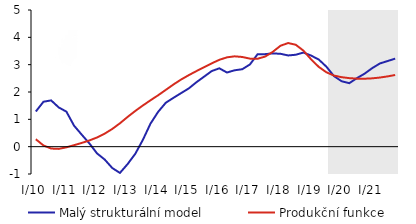
| Category | Malý strukturální model | Produkční funkce |
|---|---|---|
| I/10 | 1.287 | 0.271 |
| II | 1.644 | 0.044 |
| III | 1.693 | -0.068 |
| IV | 1.435 | -0.081 |
| I/11 | 1.281 | -0.024 |
| II | 0.769 | 0.054 |
| III | 0.44 | 0.136 |
| IV | 0.121 | 0.227 |
| I/12 | -0.245 | 0.336 |
| II | -0.468 | 0.476 |
| III | -0.782 | 0.648 |
| IV | -0.96 | 0.855 |
| I/13 | -0.639 | 1.087 |
| II | -0.264 | 1.305 |
| III | 0.249 | 1.507 |
| IV | 0.844 | 1.697 |
| I/14 | 1.275 | 1.881 |
| II | 1.607 | 2.078 |
| III | 1.787 | 2.275 |
| IV | 1.959 | 2.456 |
| I/15 | 2.13 | 2.616 |
| II | 2.356 | 2.764 |
| III | 2.56 | 2.907 |
| IV | 2.765 | 3.048 |
| I/16 | 2.867 | 3.177 |
| II | 2.713 | 3.268 |
| III | 2.795 | 3.305 |
| IV | 2.833 | 3.281 |
| I/17 | 3.008 | 3.221 |
| II | 3.38 | 3.216 |
| III | 3.386 | 3.297 |
| IV | 3.412 | 3.47 |
| I/18 | 3.398 | 3.692 |
| II | 3.337 | 3.791 |
| III | 3.363 | 3.728 |
| IV | 3.443 | 3.513 |
| I/19 | 3.333 | 3.196 |
| II | 3.189 | 2.92 |
| III | 2.927 | 2.722 |
| IV | 2.579 | 2.601 |
| I/20 | 2.392 | 2.542 |
| II | 2.322 | 2.508 |
| III | 2.507 | 2.489 |
| IV | 2.671 | 2.486 |
| I/21 | 2.874 | 2.5 |
| II | 3.044 | 2.529 |
| III | 3.132 | 2.571 |
| IV | 3.221 | 2.622 |